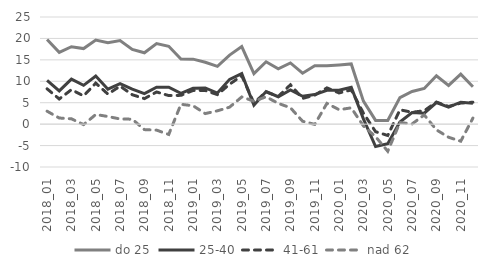
| Category | do 25 | 25-40 | 41-61 | nad 62 |
|---|---|---|---|---|
| 2018_01 | 19.739 | 10.214 | 8.245 | 3.02 |
| 2018_02 | 16.747 | 7.751 | 5.869 | 1.43 |
| 2018_03 | 18.073 | 10.5 | 8.041 | 1.255 |
| 2018_04 | 17.637 | 9.053 | 6.594 | -0.111 |
| 2018_05 | 19.62 | 11.246 | 9.574 | 2.249 |
| 2018_06 | 18.998 | 8.165 | 7.004 | 1.781 |
| 2018_07 | 19.519 | 9.445 | 8.865 | 1.202 |
| 2018_08 | 17.447 | 8.156 | 6.869 | 1.159 |
| 2018_09 | 16.654 | 7.135 | 5.955 | -1.277 |
| 2018_10 | 18.81 | 8.603 | 7.504 | -1.398 |
| 2018_11 | 18.167 | 8.634 | 6.668 | -2.404 |
| 2018_12 | 15.174 | 7.184 | 6.719 | 4.627 |
| 2019_01 | 15.162 | 8.36 | 7.859 | 4.293 |
| 2019_02 | 14.443 | 8.457 | 7.867 | 2.465 |
| 2019_03 | 13.481 | 7.256 | 6.887 | 3.111 |
| 2019_04 | 16.121 | 10.451 | 9.314 | 3.96 |
| 2019_05 | 18.114 | 11.778 | 11.282 | 6.343 |
| 2019_06 | 11.795 | 4.424 | 4.942 | 5.35 |
| 2019_07 | 14.558 | 7.596 | 7.532 | 6.374 |
| 2019_08 | 12.887 | 6.393 | 6.451 | 4.847 |
| 2019_09 | 14.28 | 7.968 | 9.188 | 3.826 |
| 2019_10 | 11.877 | 6.51 | 6.006 | 0.677 |
| 2019_11 | 13.615 | 6.9 | 6.772 | -0.057 |
| 2019_12 | 13.604 | 7.912 | 8.466 | 4.844 |
| 2020_01 | 13.807 | 7.91 | 7.276 | 3.371 |
| 2020_02 | 14.045 | 8.604 | 7.982 | 3.803 |
| 2020_03 | 5.378 | 1.227 | 2.569 | -0.413 |
| 2020_04 | 0.87 | -5.212 | -1.766 | -2.936 |
| 2020_05 | 0.852 | -4.567 | -2.647 | -6.325 |
| 2020_06 | 6.203 | 0.474 | 3.345 | 0.388 |
| 2020_07 | 7.634 | 2.687 | 2.774 | 0.046 |
| 2020_08 | 8.33 | 2.565 | 3.132 | 2.146 |
| 2020_09 | 11.294 | 5.04 | 5.155 | -1.336 |
| 2020_10 | 9.035 | 3.974 | 4.126 | -3.054 |
| 2020_11 | 11.658 | 5.129 | 4.912 | -3.981 |
| 2020_12 | 8.733 | 4.9 | 5.117 | 1.41 |